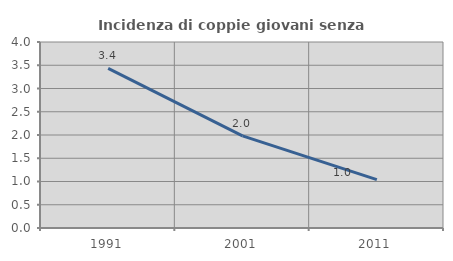
| Category | Incidenza di coppie giovani senza figli |
|---|---|
| 1991.0 | 3.432 |
| 2001.0 | 1.98 |
| 2011.0 | 1.039 |